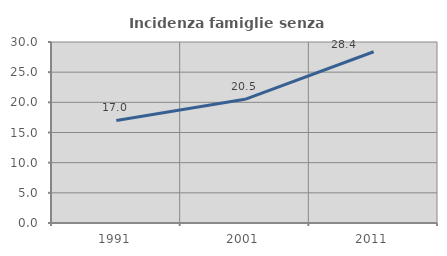
| Category | Incidenza famiglie senza nuclei |
|---|---|
| 1991.0 | 17.004 |
| 2001.0 | 20.504 |
| 2011.0 | 28.382 |